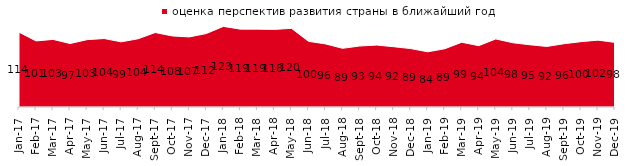
| Category | оценка перспектив развития страны в ближайший год |
|---|---|
| 2017-01-01 | 114 |
| 2017-02-01 | 100.75 |
| 2017-03-01 | 103.05 |
| 2017-04-01 | 96.75 |
| 2017-05-01 | 102.7 |
| 2017-06-01 | 104.35 |
| 2017-07-01 | 99.3 |
| 2017-08-01 | 104.05 |
| 2017-09-01 | 113.5 |
| 2017-10-01 | 108.35 |
| 2017-11-01 | 106.85 |
| 2017-12-01 | 111.95 |
| 2018-01-01 | 122.9 |
| 2018-02-01 | 118.7 |
| 2018-03-01 | 118.7 |
| 2018-04-01 | 118.3 |
| 2018-05-01 | 119.9 |
| 2018-06-01 | 100.1 |
| 2018-07-01 | 96.2 |
| 2018-08-01 | 89.45 |
| 2018-09-01 | 92.95 |
| 2018-10-01 | 94.4 |
| 2018-11-01 | 91.916 |
| 2018-12-01 | 89.05 |
| 2019-01-01 | 84.15 |
| 2019-02-01 | 88.75 |
| 2019-03-01 | 98.657 |
| 2019-04-01 | 93.515 |
| 2019-05-01 | 103.764 |
| 2019-06-01 | 97.955 |
| 2019-07-01 | 94.851 |
| 2019-08-01 | 92.308 |
| 2019-09-01 | 96.436 |
| 2019-10-01 | 99.604 |
| 2019-11-01 | 101.931 |
| 2019-12-01 | 98.465 |